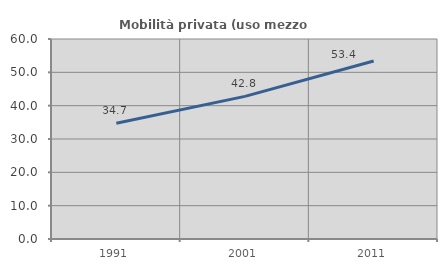
| Category | Mobilità privata (uso mezzo privato) |
|---|---|
| 1991.0 | 34.748 |
| 2001.0 | 42.79 |
| 2011.0 | 53.39 |